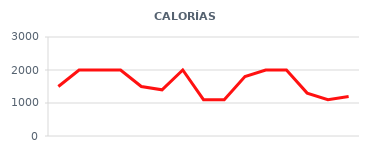
| Category | Series 0 |
|---|---|
| 6/1/12 | 1500 |
| 6/2/12 | 2000 |
| 6/3/12 | 2000 |
| 6/4/12 | 2000 |
| 6/5/12 | 1500 |
| 6/6/12 | 1400 |
| 6/7/12 | 2000 |
| 6/8/12 | 1100 |
| 6/9/12 | 1100 |
| 6/10/12 | 1800 |
| 6/11/12 | 2000 |
| 6/12/12 | 2000 |
| 6/13/12 | 1300 |
| 6/14/12 | 1100 |
| 6/15/12 | 1200 |